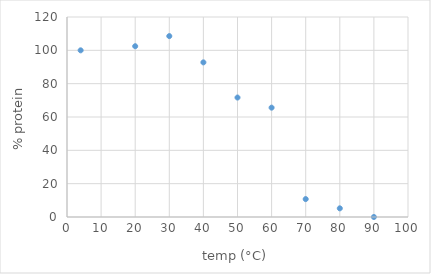
| Category | Series 0 |
|---|---|
| 4.0 | 100 |
| 20.0 | 102.47 |
| 30.0 | 108.536 |
| 40.0 | 92.776 |
| 50.0 | 71.678 |
| 60.0 | 65.61 |
| 70.0 | 10.751 |
| 80.0 | 5.202 |
| 90.0 | 0 |